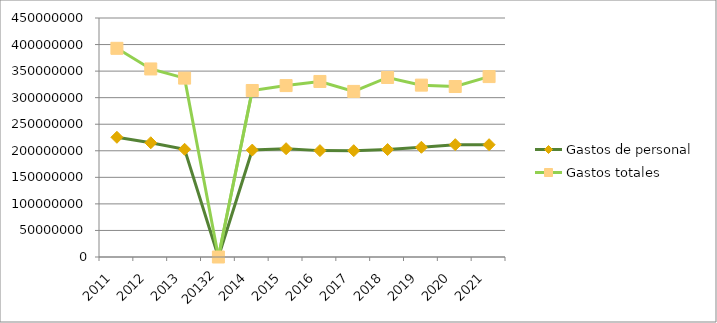
| Category | Gastos de personal  | Gastos totales  |
|---|---|---|
| 2011 | 225391661.23 | 392907659.76 |
| 2012 | 215110369.31 | 354075378.3 |
| 2013 | 202787311.75 | 336783248.85 |
| 20132 | 0 | 0 |
| 2014 | 201334556.05 | 313515763.33 |
| 2015 | 203930851.7 | 322731968.98 |
| 2016 | 200290475.98 | 330516726.43 |
| 2017 | 200188206.65 | 311782620.51 |
| 2018 | 202306908.52 | 338024022.46 |
| 2019 | 206608399.12 | 323589090.94 |
| 2020 | 211476358.46 | 320978742.58 |
| 2021 | 211455452.82 | 339696892.63 |